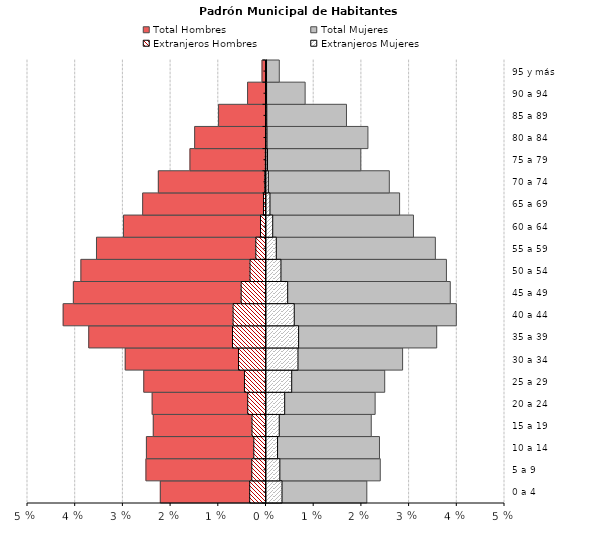
| Category | Total Hombres | Total Mujeres | Extranjeros Hombres | Extranjeros Mujeres |
|---|---|---|---|---|
| 0 a 4 | -0.022 | 0.021 | -0.003 | 0.003 |
| 5 a 9 | -0.025 | 0.024 | -0.003 | 0.003 |
| 10 a 14 | -0.025 | 0.024 | -0.003 | 0.002 |
| 15 a 19 | -0.024 | 0.022 | -0.003 | 0.003 |
| 20 a 24 | -0.024 | 0.023 | -0.004 | 0.004 |
| 25 a 29 | -0.026 | 0.025 | -0.005 | 0.005 |
| 30 a 34 | -0.03 | 0.029 | -0.006 | 0.007 |
| 35 a 39 | -0.037 | 0.036 | -0.007 | 0.007 |
| 40 a 44 | -0.043 | 0.04 | -0.007 | 0.006 |
| 45 a 49 | -0.04 | 0.039 | -0.005 | 0.004 |
| 50 a 54 | -0.039 | 0.038 | -0.003 | 0.003 |
| 55 a 59 | -0.036 | 0.035 | -0.002 | 0.002 |
| 60 a 64 | -0.03 | 0.031 | -0.001 | 0.001 |
| 65 a 69 | -0.026 | 0.028 | -0.001 | 0.001 |
| 70 a 74 | -0.023 | 0.026 | 0 | 0 |
| 75 a 79 | -0.016 | 0.02 | 0 | 0 |
| 80 a 84 | -0.015 | 0.021 | 0 | 0 |
| 85 a 89 | -0.01 | 0.017 | 0 | 0 |
| 90 a 94 | -0.004 | 0.008 | 0 | 0 |
| 95 y más | -0.001 | 0.003 | 0 | 0 |